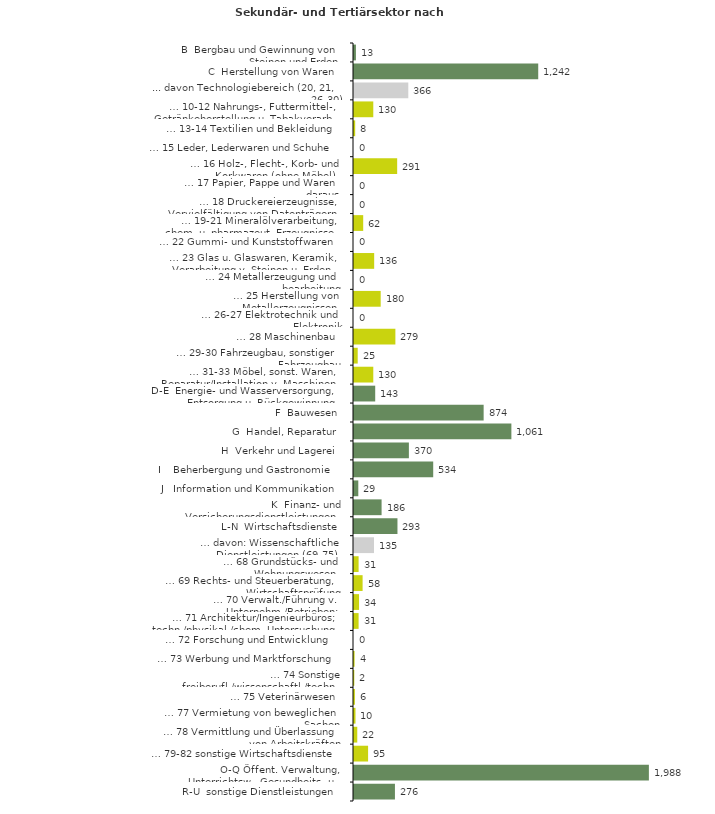
| Category | Series 0 |
|---|---|
| B  Bergbau und Gewinnung von Steinen und Erden | 13 |
| C  Herstellung von Waren | 1242 |
| ... davon Technologiebereich (20, 21, 26-30) | 366 |
| … 10-12 Nahrungs-, Futtermittel-, Getränkeherstellung u. Tabakverarb. | 130 |
| … 13-14 Textilien und Bekleidung | 8 |
| … 15 Leder, Lederwaren und Schuhe | 0 |
| … 16 Holz-, Flecht-, Korb- und Korkwaren (ohne Möbel)  | 291 |
| … 17 Papier, Pappe und Waren daraus  | 0 |
| … 18 Druckereierzeugnisse, Vervielfältigung von Datenträgern | 0 |
| … 19-21 Mineralölverarbeitung, chem. u. pharmazeut. Erzeugnisse | 62 |
| … 22 Gummi- und Kunststoffwaren | 0 |
| … 23 Glas u. Glaswaren, Keramik, Verarbeitung v. Steinen u. Erden  | 136 |
| … 24 Metallerzeugung und -bearbeitung | 0 |
| … 25 Herstellung von Metallerzeugnissen  | 180 |
| … 26-27 Elektrotechnik und Elektronik | 0 |
| … 28 Maschinenbau | 279 |
| … 29-30 Fahrzeugbau, sonstiger Fahrzeugbau | 25 |
| … 31-33 Möbel, sonst. Waren, Reparatur/Installation v. Maschinen | 130 |
| D-E  Energie- und Wasserversorgung, Entsorgung u. Rückgewinnung | 143 |
| F  Bauwesen | 874 |
| G  Handel, Reparatur | 1061 |
| H  Verkehr und Lagerei | 370 |
| I    Beherbergung und Gastronomie | 534 |
| J   Information und Kommunikation | 29 |
| K  Finanz- und Versicherungsdienstleistungen | 186 |
| L-N  Wirtschaftsdienste | 293 |
| … davon: Wissenschaftliche Dienstleistungen (69-75) | 135 |
| … 68 Grundstücks- und Wohnungswesen  | 31 |
| … 69 Rechts- und Steuerberatung, Wirtschaftsprüfung | 58 |
| … 70 Verwalt./Führung v. Unternehm./Betrieben; Unternehmensberat. | 34 |
| … 71 Architektur/Ingenieurbüros; techn./physikal./chem. Untersuchung | 31 |
| … 72 Forschung und Entwicklung  | 0 |
| … 73 Werbung und Marktforschung | 4 |
| … 74 Sonstige freiberufl./wissenschaftl./techn. Tätigkeiten | 2 |
| … 75 Veterinärwesen | 6 |
| … 77 Vermietung von beweglichen Sachen  | 10 |
| … 78 Vermittlung und Überlassung von Arbeitskräften | 22 |
| … 79-82 sonstige Wirtschaftsdienste | 95 |
| O-Q Öffent. Verwaltung, Unterrichtsw., Gesundheits- u. Sozialwesen | 1988 |
| R-U  sonstige Dienstleistungen | 276 |